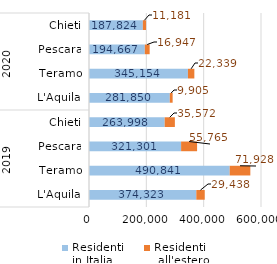
| Category | Residenti 
in Italia | Residenti
 all'estero |
|---|---|---|
| 0 | 374323 | 29438 |
| 1 | 490841 | 71928 |
| 2 | 321301 | 55765 |
| 3 | 263998 | 35572 |
| 4 | 281850 | 9905 |
| 5 | 345154 | 22339 |
| 6 | 194667 | 16947 |
| 7 | 187824 | 11181 |